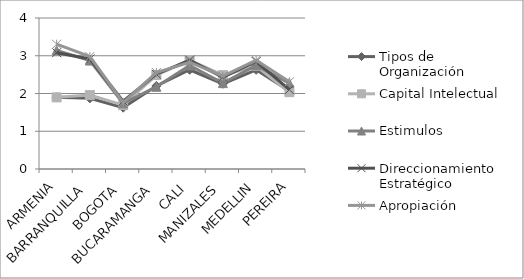
| Category | Tipos de Organización | Capital Intelectual | Estimulos | Direccionamiento Estratégico | Apropiación  |
|---|---|---|---|---|---|
| ARMENIA | 1.898 | 1.898 | 3.143 | 3.082 | 3.306 |
| BARRANQUILLA | 1.872 | 1.957 | 2.872 | 2.915 | 2.979 |
| BOGOTA | 1.625 | 1.692 | 1.74 | 1.798 | 1.76 |
| BUCARAMANGA | 2.2 | 2.489 | 2.178 | 2.511 | 2.556 |
| CALI | 2.629 | 2.886 | 2.743 | 2.886 | 2.829 |
| MANIZALES | 2.257 | 2.486 | 2.275 | 2.431 | 2.459 |
| MEDELLIN | 2.627 | 2.729 | 2.746 | 2.847 | 2.881 |
| PEREIRA | 2.069 | 2.034 | 2.276 | 2.103 | 2.31 |